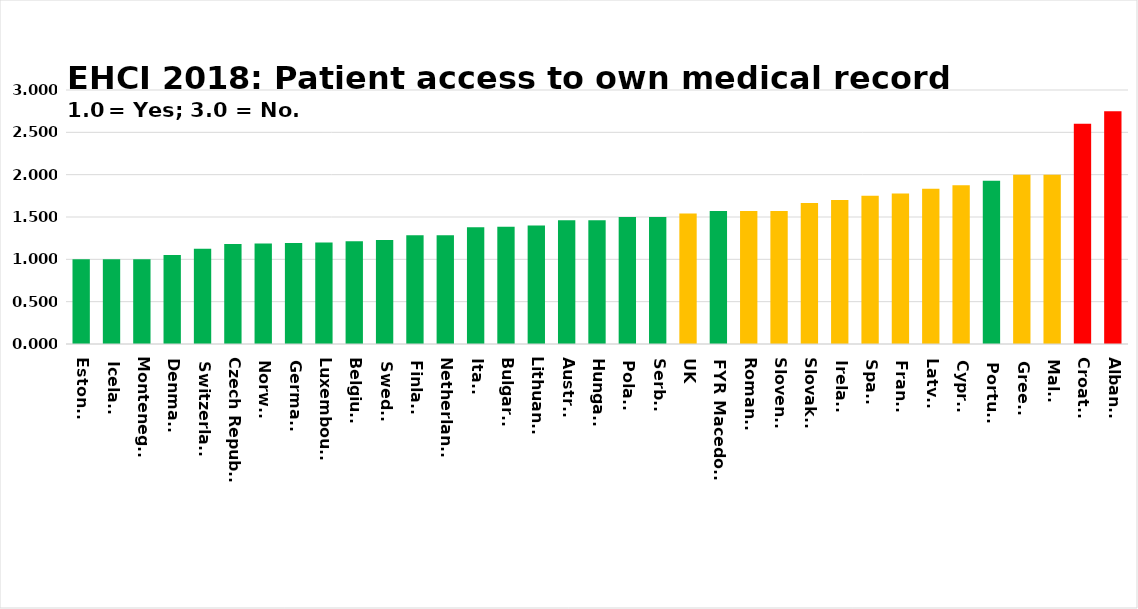
| Category | Series 0 |
|---|---|
| Estonia | 1 |
| Iceland | 1 |
| Montenegro | 1 |
| Denmark | 1.053 |
| Switzerland  | 1.125 |
| Czech Republic | 1.182 |
| Norway | 1.188 |
| Germany | 1.194 |
| Luxembourg | 1.2 |
| Belgium | 1.214 |
| Sweden | 1.227 |
| Finland | 1.286 |
| Netherlands | 1.286 |
| Italy | 1.379 |
| Bulgaria | 1.385 |
| Lithuania | 1.4 |
| Austria | 1.462 |
| Hungary | 1.462 |
| Poland | 1.5 |
| Serbia | 1.5 |
| UK | 1.543 |
| FYR Macedonia | 1.571 |
| Romania | 1.571 |
| Slovenia | 1.571 |
| Slovakia | 1.667 |
| Ireland | 1.7 |
| Spain | 1.75 |
| France | 1.776 |
| Latvia | 1.833 |
| Cyprus | 1.875 |
| Portugal | 1.929 |
| Greece | 2 |
| Malta | 2 |
| Croatia | 2.6 |
| Albania | 2.75 |